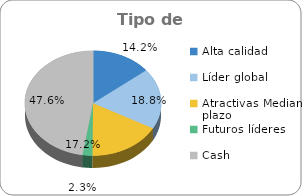
| Category | Series 0 |
|---|---|
| Alta calidad | 0.142 |
| Líder global | 0.188 |
| Atractivas Mediano plazo | 0.172 |
| Futuros líderes | 0.023 |
| Cash | 0.476 |